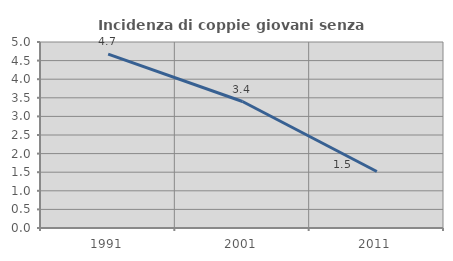
| Category | Incidenza di coppie giovani senza figli |
|---|---|
| 1991.0 | 4.673 |
| 2001.0 | 3.4 |
| 2011.0 | 1.518 |